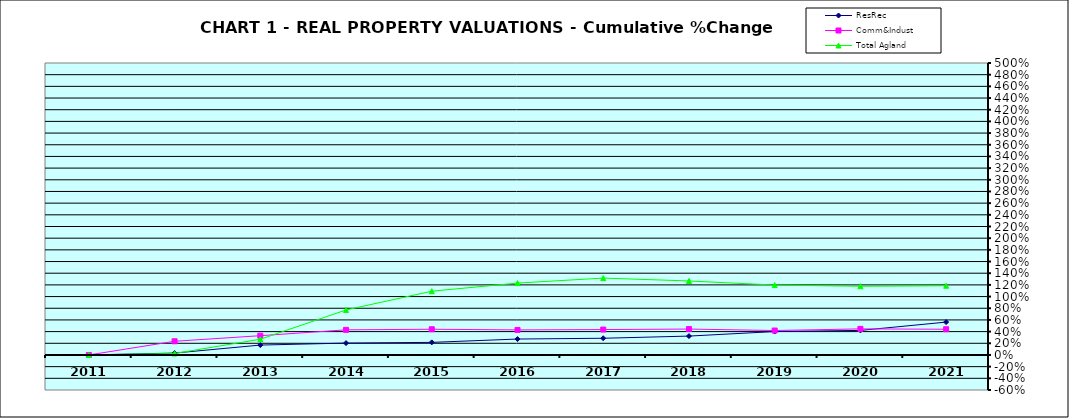
| Category | ResRec | Comm&Indust | Total Agland |
|---|---|---|---|
| 2011.0 | 0 | 0 | 0 |
| 2012.0 | 0.033 | 0.234 | 0.025 |
| 2013.0 | 0.169 | 0.33 | 0.27 |
| 2014.0 | 0.203 | 0.43 | 0.771 |
| 2015.0 | 0.216 | 0.441 | 1.092 |
| 2016.0 | 0.273 | 0.429 | 1.231 |
| 2017.0 | 0.286 | 0.435 | 1.316 |
| 2018.0 | 0.323 | 0.444 | 1.267 |
| 2019.0 | 0.401 | 0.418 | 1.197 |
| 2020.0 | 0.421 | 0.447 | 1.177 |
| 2021.0 | 0.563 | 0.44 | 1.185 |